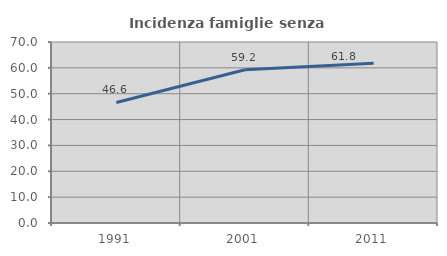
| Category | Incidenza famiglie senza nuclei |
|---|---|
| 1991.0 | 46.61 |
| 2001.0 | 59.239 |
| 2011.0 | 61.803 |